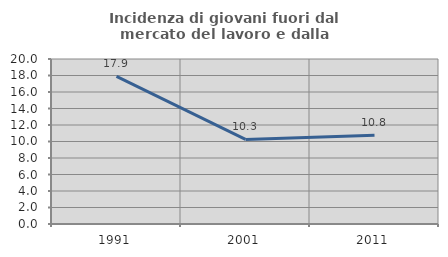
| Category | Incidenza di giovani fuori dal mercato del lavoro e dalla formazione  |
|---|---|
| 1991.0 | 17.886 |
| 2001.0 | 10.256 |
| 2011.0 | 10.757 |